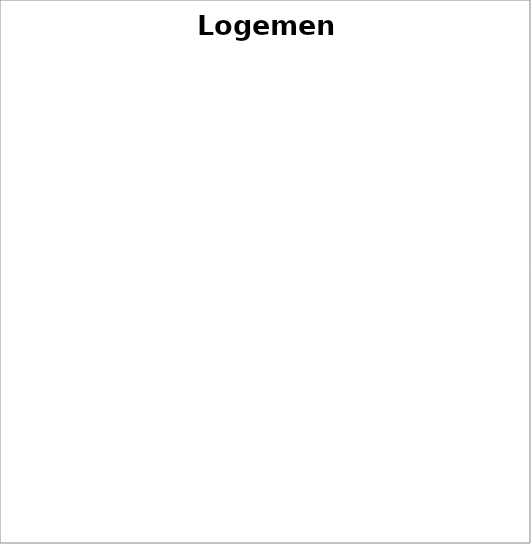
| Category | Series 0 |
|---|---|
| Loyer | 0 |
| Charges de copropriété | 0 |
| Mensualité prêt immobilier | 0 |
| Assurance habitation | 0 |
| Taxe d'habitation / taxe foncière | 0 |
| Crédits conso | 0 |
| Autres | 0 |